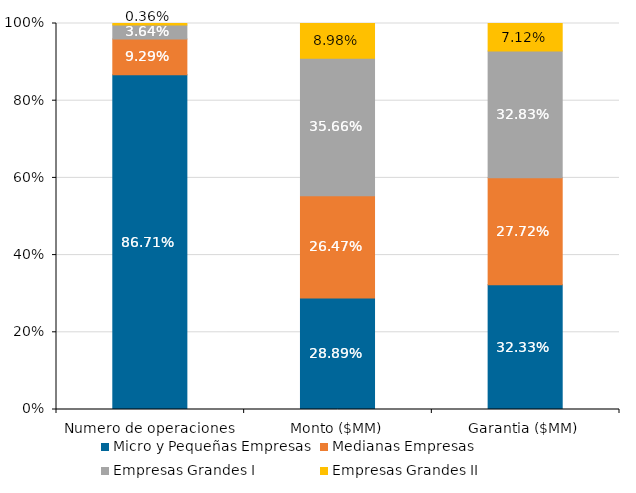
| Category | Micro y Pequeñas Empresas | Medianas Empresas | Empresas Grandes I | Empresas Grandes II |
|---|---|---|---|---|
| Numero de operaciones | 0.867 | 0.093 | 0.036 | 0.004 |
| Monto ($MM) | 0.289 | 0.265 | 0.357 | 0.09 |
| Garantia ($MM) | 0.323 | 0.277 | 0.328 | 0.071 |